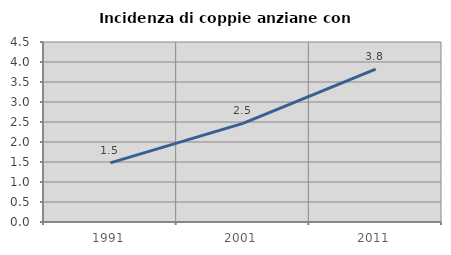
| Category | Incidenza di coppie anziane con figli |
|---|---|
| 1991.0 | 1.479 |
| 2001.0 | 2.467 |
| 2011.0 | 3.819 |